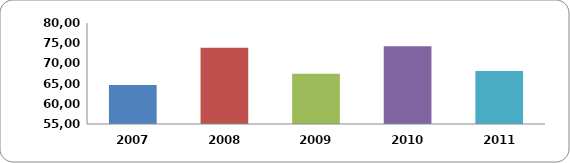
| Category | Personas Capacitadas |
|---|---|
| 2007 | 64679 |
| 2008 | 73862 |
| 2009 | 67438 |
| 2010 | 74265 |
| 2011 | 68098 |